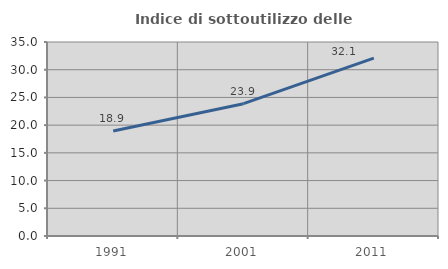
| Category | Indice di sottoutilizzo delle abitazioni  |
|---|---|
| 1991.0 | 18.947 |
| 2001.0 | 23.87 |
| 2011.0 | 32.09 |